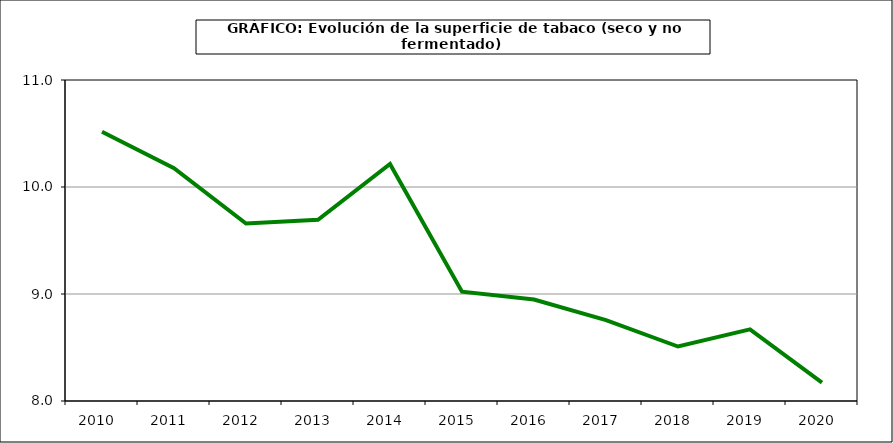
| Category | Superficie |
|---|---|
| 2010.0 | 10.517 |
| 2011.0 | 10.175 |
| 2012.0 | 9.659 |
| 2013.0 | 9.693 |
| 2014.0 | 10.215 |
| 2015.0 | 9.022 |
| 2016.0 | 8.949 |
| 2017.0 | 8.756 |
| 2018.0 | 8.509 |
| 2019.0 | 8.67 |
| 2020.0 | 8.172 |